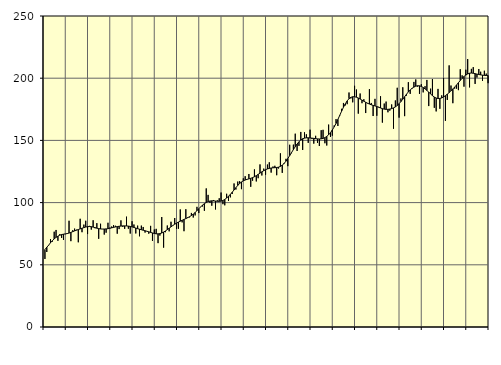
| Category | Piggar | Series 1 |
|---|---|---|
| nan | 54.7 | 62.25 |
| 1.0 | 60.3 | 64.12 |
| 1.0 | 65.5 | 65.76 |
| 1.0 | 70.6 | 67.71 |
| 1.0 | 68.6 | 69.36 |
| 1.0 | 76.6 | 70.84 |
| 1.0 | 78 | 72.06 |
| 1.0 | 69.3 | 73.01 |
| 1.0 | 74.6 | 73.79 |
| 1.0 | 71.6 | 74.29 |
| 1.0 | 70 | 74.62 |
| 1.0 | 74.6 | 74.84 |
| nan | 74.8 | 75.1 |
| 2.0 | 85.4 | 75.51 |
| 2.0 | 69 | 76.05 |
| 2.0 | 77.8 | 76.64 |
| 2.0 | 79.1 | 77.24 |
| 2.0 | 78.2 | 77.81 |
| 2.0 | 68.1 | 78.35 |
| 2.0 | 87 | 78.88 |
| 2.0 | 76.2 | 79.4 |
| 2.0 | 82.3 | 79.89 |
| 2.0 | 85.4 | 80.35 |
| 2.0 | 74.7 | 80.67 |
| nan | 81.3 | 80.78 |
| 3.0 | 78.3 | 80.65 |
| 3.0 | 85.8 | 80.32 |
| 3.0 | 79.4 | 79.88 |
| 3.0 | 83.5 | 79.44 |
| 3.0 | 70.9 | 79.08 |
| 3.0 | 83 | 78.84 |
| 3.0 | 78.8 | 78.74 |
| 3.0 | 74.3 | 78.75 |
| 3.0 | 75.8 | 78.85 |
| 3.0 | 83.8 | 79.03 |
| 3.0 | 79.9 | 79.32 |
| nan | 80.8 | 79.7 |
| 4.0 | 81.9 | 80.08 |
| 4.0 | 81.4 | 80.43 |
| 4.0 | 75 | 80.71 |
| 4.0 | 78.7 | 80.96 |
| 4.0 | 85.7 | 81.15 |
| 4.0 | 80.5 | 81.28 |
| 4.0 | 78.9 | 81.29 |
| 4.0 | 88.7 | 81.23 |
| 4.0 | 79 | 81.1 |
| 4.0 | 75.1 | 80.84 |
| 4.0 | 85 | 80.48 |
| nan | 82.4 | 80.03 |
| 5.0 | 75.2 | 79.53 |
| 5.0 | 81.5 | 79.04 |
| 5.0 | 72.9 | 78.61 |
| 5.0 | 81.5 | 78.19 |
| 5.0 | 80.4 | 77.78 |
| 5.0 | 75.9 | 77.38 |
| 5.0 | 76.9 | 76.96 |
| 5.0 | 75 | 76.52 |
| 5.0 | 81.3 | 76.04 |
| 5.0 | 69.2 | 75.59 |
| 5.0 | 78.4 | 75.19 |
| nan | 78.9 | 74.91 |
| 6.0 | 67.4 | 74.87 |
| 6.0 | 73.5 | 75.08 |
| 6.0 | 88.4 | 75.54 |
| 6.0 | 63.8 | 76.29 |
| 6.0 | 76.2 | 77.22 |
| 6.0 | 81.6 | 78.27 |
| 6.0 | 76.9 | 79.4 |
| 6.0 | 84.6 | 80.52 |
| 6.0 | 81.4 | 81.6 |
| 6.0 | 87.6 | 82.61 |
| 6.0 | 78.9 | 83.52 |
| nan | 79 | 84.33 |
| 7.0 | 94.5 | 85.06 |
| 7.0 | 84.1 | 85.76 |
| 7.0 | 77 | 86.46 |
| 7.0 | 94.7 | 87.14 |
| 7.0 | 88.3 | 87.88 |
| 7.0 | 88.1 | 88.68 |
| 7.0 | 91.7 | 89.61 |
| 7.0 | 88 | 90.72 |
| 7.0 | 89.7 | 92.03 |
| 7.0 | 96.6 | 93.5 |
| 7.0 | 91.6 | 95.06 |
| nan | 96.8 | 96.58 |
| 8.0 | 96.9 | 97.97 |
| 8.0 | 93.4 | 99.16 |
| 8.0 | 111.4 | 100.14 |
| 8.0 | 106.2 | 100.85 |
| 8.0 | 99.8 | 101.26 |
| 8.0 | 97.5 | 101.43 |
| 8.0 | 102.1 | 101.38 |
| 8.0 | 94.5 | 101.22 |
| 8.0 | 101.8 | 101.06 |
| 8.0 | 103.5 | 101.01 |
| 8.0 | 108.1 | 101.19 |
| nan | 98.7 | 101.7 |
| 9.0 | 97.8 | 102.54 |
| 9.0 | 107.1 | 103.69 |
| 9.0 | 101.3 | 105.05 |
| 9.0 | 104.2 | 106.6 |
| 9.0 | 106.9 | 108.33 |
| 9.0 | 115.4 | 110.16 |
| 9.0 | 110.5 | 112.02 |
| 9.0 | 116.9 | 113.8 |
| 9.0 | 117.2 | 115.35 |
| 9.0 | 110.8 | 116.59 |
| 9.0 | 119.5 | 117.49 |
| nan | 121.2 | 118.14 |
| 10.0 | 118.6 | 118.66 |
| 10.0 | 123 | 119.08 |
| 10.0 | 112.7 | 119.53 |
| 10.0 | 117.6 | 120.1 |
| 10.0 | 126.7 | 120.81 |
| 10.0 | 117 | 121.69 |
| 10.0 | 119.6 | 122.69 |
| 10.0 | 130.7 | 123.72 |
| 10.0 | 121.8 | 124.73 |
| 10.0 | 127.3 | 125.66 |
| 10.0 | 122.4 | 126.46 |
| nan | 130.6 | 127.07 |
| 11.0 | 132.4 | 127.51 |
| 11.0 | 124.1 | 127.8 |
| 11.0 | 129 | 127.97 |
| 11.0 | 129.6 | 128.07 |
| 11.0 | 122 | 128.19 |
| 11.0 | 127.4 | 128.5 |
| 11.0 | 139.6 | 129.11 |
| 11.0 | 123.9 | 130.11 |
| 11.0 | 131 | 131.5 |
| 11.0 | 135.2 | 133.29 |
| 11.0 | 129.3 | 135.42 |
| nan | 146.5 | 137.77 |
| 12.0 | 139.7 | 140.19 |
| 12.0 | 146.6 | 142.61 |
| 12.0 | 155.4 | 144.94 |
| 12.0 | 141.5 | 147.06 |
| 12.0 | 145.6 | 148.91 |
| 12.0 | 156.8 | 150.37 |
| 12.0 | 142.3 | 151.33 |
| 12.0 | 156.5 | 151.84 |
| 12.0 | 154.9 | 152.09 |
| 12.0 | 148 | 152.09 |
| 12.0 | 158.6 | 151.96 |
| nan | 151.1 | 151.81 |
| 13.0 | 147.4 | 151.63 |
| 13.0 | 153.7 | 151.41 |
| 13.0 | 148 | 151.22 |
| 13.0 | 145.5 | 151.14 |
| 13.0 | 158.2 | 151.27 |
| 13.0 | 158.5 | 151.61 |
| 13.0 | 147.7 | 152.23 |
| 13.0 | 145.9 | 153.2 |
| 13.0 | 162.7 | 154.51 |
| 13.0 | 152.8 | 156.21 |
| 13.0 | 153.8 | 158.35 |
| nan | 162 | 160.85 |
| 14.0 | 167.1 | 163.67 |
| 14.0 | 161.6 | 166.82 |
| 14.0 | 169.7 | 170.13 |
| 14.0 | 175.4 | 173.47 |
| 14.0 | 180.1 | 176.63 |
| 14.0 | 178.1 | 179.42 |
| 14.0 | 179.1 | 181.77 |
| 14.0 | 188.5 | 183.52 |
| 14.0 | 183.7 | 184.62 |
| 14.0 | 180.6 | 185.1 |
| 14.0 | 193.9 | 185.09 |
| nan | 190.9 | 184.71 |
| 15.0 | 171.5 | 184.06 |
| 15.0 | 187.7 | 183.22 |
| 15.0 | 179.9 | 182.36 |
| 15.0 | 183.1 | 181.5 |
| 15.0 | 172 | 180.66 |
| 15.0 | 179.6 | 179.88 |
| 15.0 | 191.2 | 179.22 |
| 15.0 | 180.1 | 178.63 |
| 15.0 | 169.6 | 178.15 |
| 15.0 | 183.4 | 177.73 |
| 15.0 | 169.8 | 177.22 |
| nan | 177 | 176.63 |
| 16.0 | 185.5 | 176.06 |
| 16.0 | 164.3 | 175.53 |
| 16.0 | 179.6 | 175.13 |
| 16.0 | 181.2 | 174.95 |
| 16.0 | 172.6 | 174.96 |
| 16.0 | 173.9 | 175.18 |
| 16.0 | 178.9 | 175.56 |
| 16.0 | 159.4 | 176.12 |
| 16.0 | 182.1 | 176.94 |
| 16.0 | 192.3 | 178.05 |
| 16.0 | 168.3 | 179.47 |
| nan | 183.7 | 181.2 |
| 17.0 | 192.7 | 183.12 |
| 17.0 | 169.5 | 185.13 |
| 17.0 | 186 | 187.12 |
| 17.0 | 196.8 | 188.96 |
| 17.0 | 187.4 | 190.57 |
| 17.0 | 191.5 | 191.87 |
| 17.0 | 197 | 192.86 |
| 17.0 | 199 | 193.57 |
| 17.0 | 193.2 | 193.94 |
| 17.0 | 187.4 | 193.87 |
| 17.0 | 195.2 | 193.4 |
| nan | 188.6 | 192.53 |
| 18.0 | 193.6 | 191.4 |
| 18.0 | 198.6 | 190.15 |
| 18.0 | 177.6 | 188.81 |
| 18.0 | 191.6 | 187.36 |
| 18.0 | 199.3 | 185.98 |
| 18.0 | 176.2 | 184.86 |
| 18.0 | 173.3 | 184.07 |
| 18.0 | 191.4 | 183.7 |
| 18.0 | 175.4 | 183.72 |
| 18.0 | 186.2 | 184.13 |
| 18.0 | 200.2 | 184.91 |
| nan | 165.7 | 185.96 |
| 19.0 | 182.5 | 187.15 |
| 19.0 | 210.3 | 188.45 |
| 19.0 | 194.1 | 189.85 |
| 19.0 | 179.9 | 191.34 |
| 19.0 | 191.6 | 192.9 |
| 19.0 | 191.6 | 194.57 |
| 19.0 | 190.4 | 196.38 |
| 19.0 | 207.2 | 198.18 |
| 19.0 | 202.3 | 199.86 |
| 19.0 | 193.2 | 201.35 |
| 19.0 | 206.8 | 202.54 |
| nan | 215.4 | 203.41 |
| 20.0 | 192.6 | 204 |
| 20.0 | 207.5 | 204.16 |
| 20.0 | 208.9 | 203.97 |
| 20.0 | 195.4 | 203.64 |
| 20.0 | 200.5 | 203.3 |
| 20.0 | 207.4 | 202.97 |
| 20.0 | 205.2 | 202.68 |
| 20.0 | 197.8 | 202.44 |
| 20.0 | 206 | 202.25 |
| 20.0 | 203.7 | 202.17 |
| 20.0 | 196 | 202.2 |